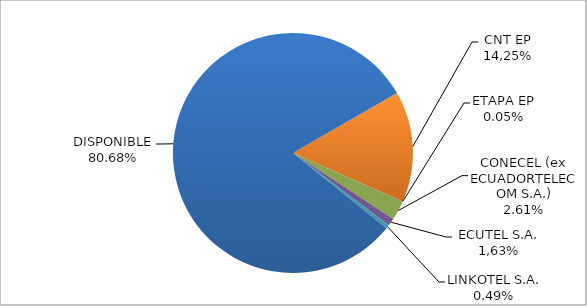
| Category | CODIGO DE AREA 4 |
|---|---|
| CORPORACIÓN NACIONAL TELECOMUNICACIONES CNT EP | 0.149 |
| ETAPA EP | 0.001 |
| CONECEL (ex ECUADORTELECOM S.A.) | 0.026 |
| SETEL S.A. | 0.01 |
| LINKOTEL S.A. | 0.005 |
| DISPONIBLE | 0.807 |